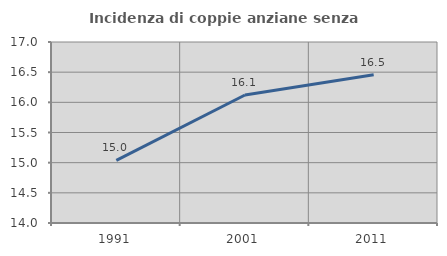
| Category | Incidenza di coppie anziane senza figli  |
|---|---|
| 1991.0 | 15.038 |
| 2001.0 | 16.121 |
| 2011.0 | 16.456 |